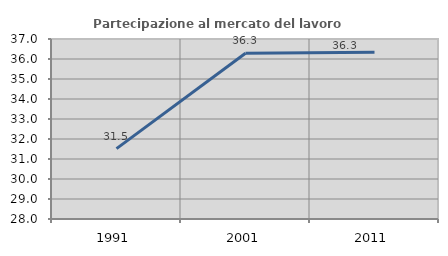
| Category | Partecipazione al mercato del lavoro  femminile |
|---|---|
| 1991.0 | 31.52 |
| 2001.0 | 36.286 |
| 2011.0 | 36.336 |